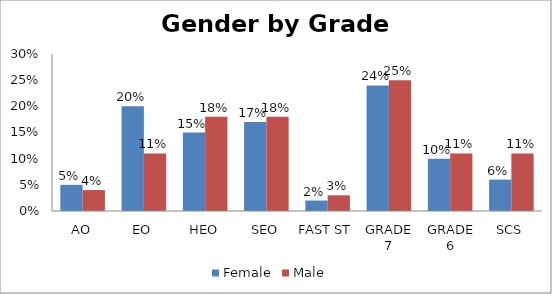
| Category | Female | Male |
|---|---|---|
| AO | 0.05 | 0.04 |
| EO | 0.2 | 0.11 |
| HEO | 0.15 | 0.18 |
| SEO | 0.17 | 0.18 |
| FAST ST | 0.02 | 0.03 |
| GRADE 7 | 0.24 | 0.25 |
| GRADE 6 | 0.1 | 0.11 |
| SCS | 0.06 | 0.11 |